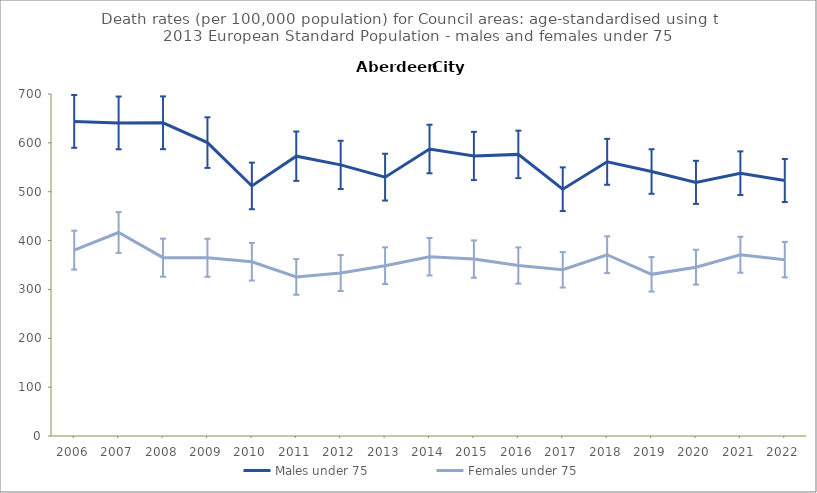
| Category | Males under 75 | Females under 75 |
|---|---|---|
| 2006.0 | 643.9 | 380.4 |
| 2007.0 | 640.8 | 416.5 |
| 2008.0 | 641.1 | 365 |
| 2009.0 | 600.5 | 364.8 |
| 2010.0 | 511.8 | 356.7 |
| 2011.0 | 572.7 | 325.6 |
| 2012.0 | 554.9 | 333.6 |
| 2013.0 | 529.8 | 348.6 |
| 2014.0 | 587.4 | 367 |
| 2015.0 | 573.2 | 362.2 |
| 2016.0 | 576.4 | 348.9 |
| 2017.0 | 505.1 | 340.2 |
| 2018.0 | 561.2 | 371 |
| 2019.0 | 541.3 | 330.9 |
| 2020.0 | 519.1 | 345.5 |
| 2021.0 | 537.9 | 371 |
| 2022.0 | 522.9 | 360.9 |